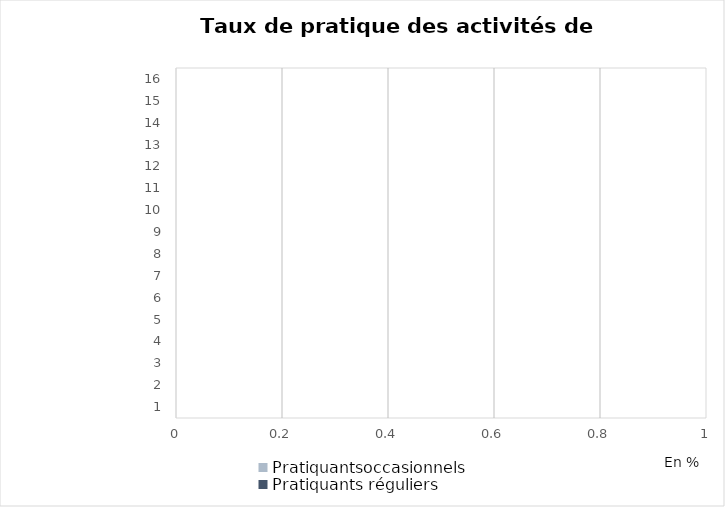
| Category | Pratiquantsoccasionnels | Pratiquants réguliers |
|---|---|---|
| 0 | 1.7 | 0.1 |
| 1 | 3 | 0 |
| 2 | 4.6 | 0.2 |
| 3 | 1.1 | 0.1 |
| 4 | 1.2 | 0.7 |
| 5 | 4.2 | 0 |
| 6 | 5.8 | 0.9 |
| 7 | 2.2 | 0.1 |
| 8 | 9.5 | 1.2 |
| 9 | 10.2 | 1.3 |
| 10 | 0.9 | 0.1 |
| 11 | 1.3 | 0.1 |
| 12 | 1.6 | 0.1 |
| 13 | 10.5 | 0.5 |
| 14 | 12.4 | 0.7 |
| 15 | 22.2 | 2.9 |